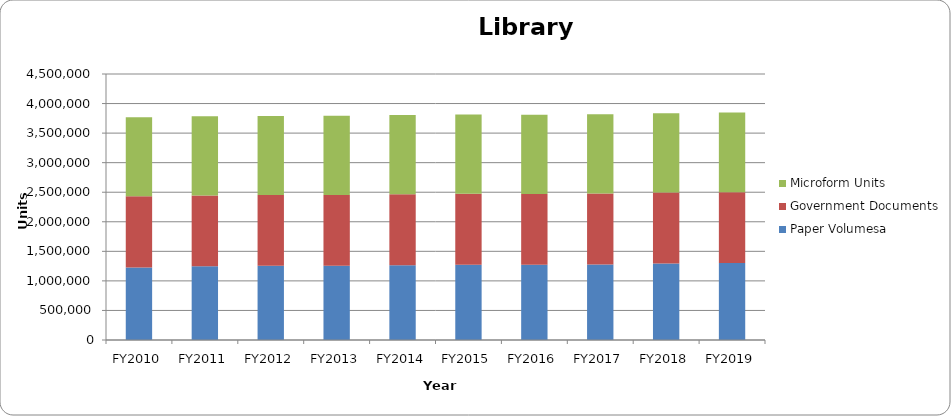
| Category | Paper Volumesa | Government Documents | Microform Units |
|---|---|---|---|
| FY2010 | 1228382 | 1202303 | 1335705 |
| FY2011 | 1245586 | 1200455 | 1337414 |
| FY2012 | 1255081 | 1196667 | 1339176 |
| FY2013 | 1254810 | 1199050 | 1339472 |
| FY2014 | 1263647 | 1200207 | 1340932 |
| FY2015 | 1271979 | 1201307 | 1341933 |
| FY2016 | 1273937 | 1195052 | 1342830 |
| FY2017 | 1277676 | 1199249 | 1343937 |
| FY2018 | 1296074 | 1197513 | 1343956 |
| FY2019 | 1304427 | 1197009 | 1345800 |